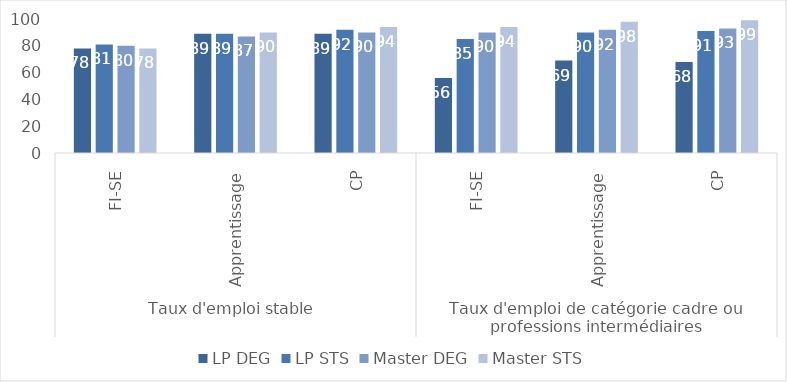
| Category | LP DEG | LP STS | Master DEG | Master STS |
|---|---|---|---|---|
| 0 | 78 | 81 | 80 | 78 |
| 1 | 89 | 89 | 87 | 90 |
| 2 | 89 | 92 | 90 | 94 |
| 3 | 56 | 85 | 90 | 94 |
| 4 | 69 | 90 | 92 | 98 |
| 5 | 68 | 91 | 93 | 99 |